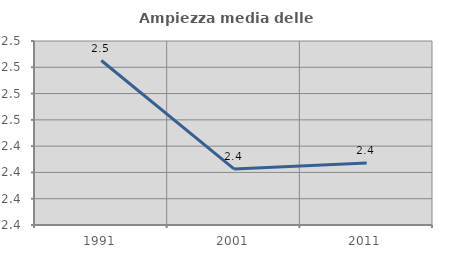
| Category | Ampiezza media delle famiglie |
|---|---|
| 1991.0 | 2.505 |
| 2001.0 | 2.423 |
| 2011.0 | 2.427 |